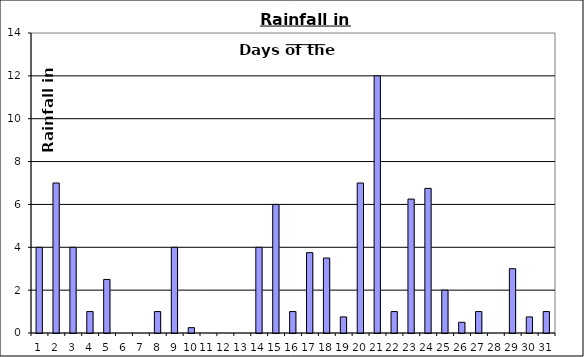
| Category | Series 0 |
|---|---|
| 0 | 4 |
| 1 | 7 |
| 2 | 4 |
| 3 | 1 |
| 4 | 2.5 |
| 5 | 0 |
| 6 | 0 |
| 7 | 1 |
| 8 | 4 |
| 9 | 0.25 |
| 10 | 0 |
| 11 | 0 |
| 12 | 0 |
| 13 | 4 |
| 14 | 6 |
| 15 | 1 |
| 16 | 3.75 |
| 17 | 3.5 |
| 18 | 0.75 |
| 19 | 7 |
| 20 | 12 |
| 21 | 1 |
| 22 | 6.25 |
| 23 | 6.75 |
| 24 | 2 |
| 25 | 0.5 |
| 26 | 1 |
| 27 | 0 |
| 28 | 3 |
| 29 | 0.75 |
| 30 | 1 |